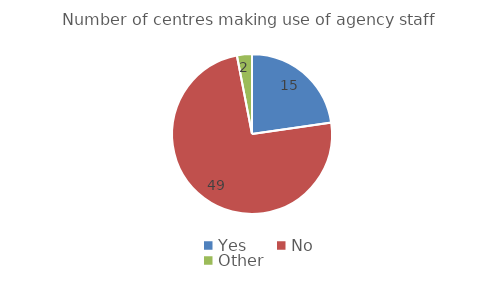
| Category | Series 0 |
|---|---|
| Yes | 15 |
| No | 49 |
| Other | 2 |